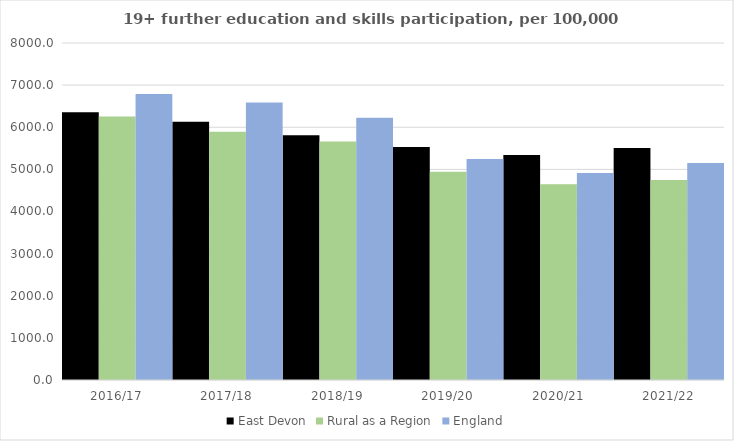
| Category | East Devon | Rural as a Region | England |
|---|---|---|---|
| 2016/17 | 6356 | 6253.401 | 6788 |
| 2017/18 | 6128 | 5892.029 | 6588 |
| 2018/19 | 5810 | 5661.873 | 6227 |
| 2019/20 | 5530 | 4943.801 | 5244 |
| 2020/21 | 5339 | 4646.727 | 4913 |
| 2021/22 | 5507 | 4747.049 | 5151 |